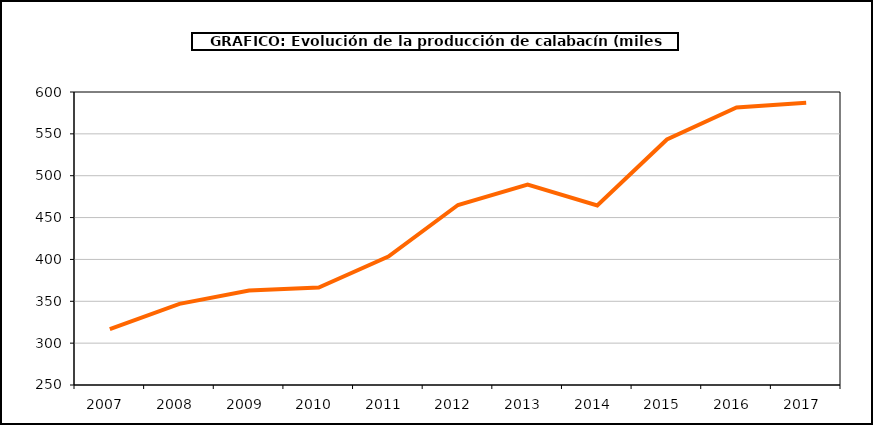
| Category | producción |
|---|---|
| 2007.0 | 316.725 |
| 2008.0 | 346.959 |
| 2009.0 | 362.773 |
| 2010.0 | 366.498 |
| 2011.0 | 403.38 |
| 2012.0 | 465.039 |
| 2013.0 | 489.297 |
| 2014.0 | 464.496 |
| 2015.0 | 543.195 |
| 2016.0 | 581.503 |
| 2017.0 | 587.174 |